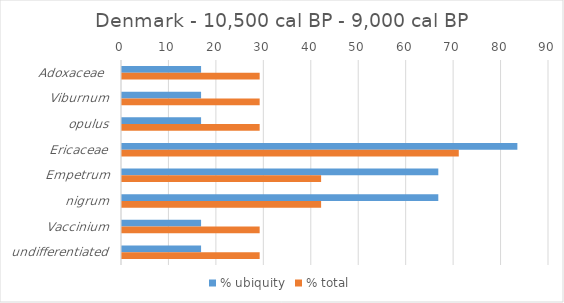
| Category | % ubiquity | % total |
|---|---|---|
| Adoxaceae  | 16.667 | 29.016 |
| Viburnum | 16.667 | 29.016 |
| opulus | 16.667 | 29.016 |
| Ericaceae | 83.333 | 70.984 |
| Empetrum | 66.667 | 41.968 |
| nigrum | 66.667 | 41.968 |
| Vaccinium | 16.667 | 29.016 |
| undifferentiated | 16.667 | 29.016 |